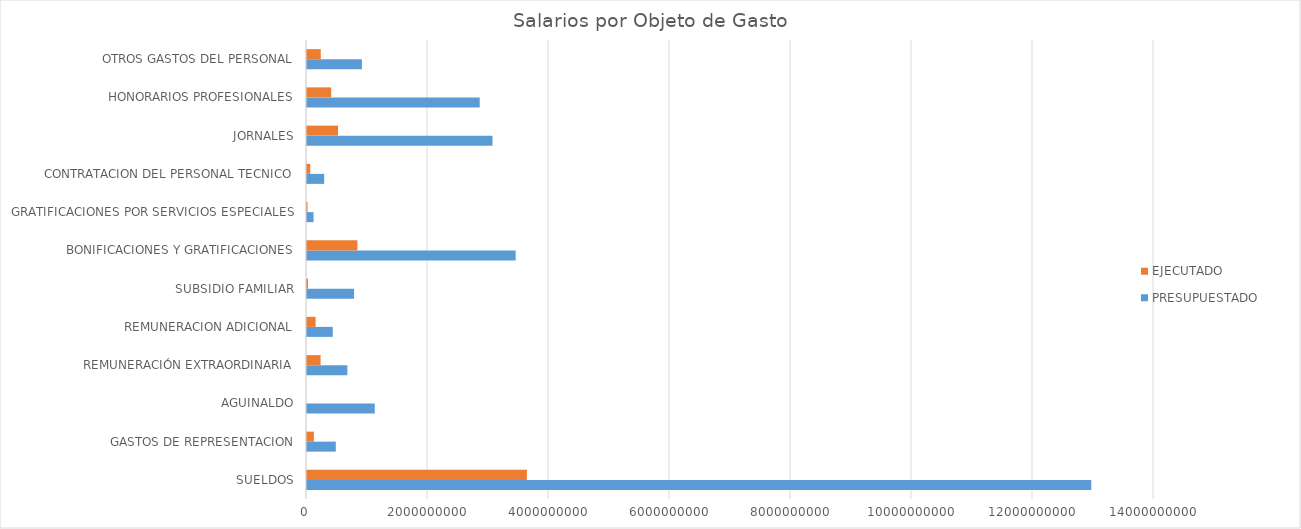
| Category | PRESUPUESTADO | EJECUTADO |
|---|---|---|
| SUELDOS | 12963476218 | 3634617278 |
| GASTOS DE REPRESENTACION | 476214000 | 113781500 |
| AGUINALDO | 1119974185 | 0 |
| REMUNERACIÓN EXTRAORDINARIA | 667333416 | 224833661 |
| REMUNERACION ADICIONAL | 425863008 | 142108802 |
| SUBSIDIO FAMILIAR | 778300000 | 17301842 |
| BONIFICACIONES Y GRATIFICACIONES | 3449010080 | 833021058 |
| GRATIFICACIONES POR SERVICIOS ESPECIALES | 108000000 | 9000000 |
| CONTRATACION DEL PERSONAL TECNICO | 284075000 | 53783250 |
| JORNALES | 3065965597 | 512209931 |
| HONORARIOS PROFESIONALES | 2854469600 | 399866140 |
| OTROS GASTOS DEL PERSONAL | 907314396 | 227081718 |